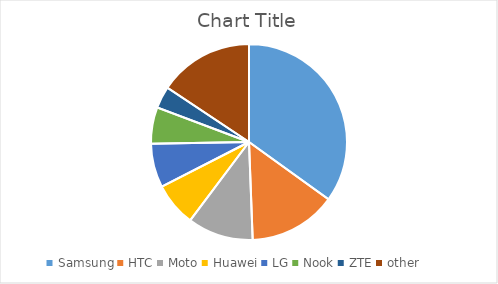
| Category | Series 0 |
|---|---|
| Samsung | 29 |
| HTC | 12 |
| Moto | 9 |
| Huawei | 6 |
| LG | 6 |
| Nook | 5 |
| ZTE | 3 |
| other | 13 |